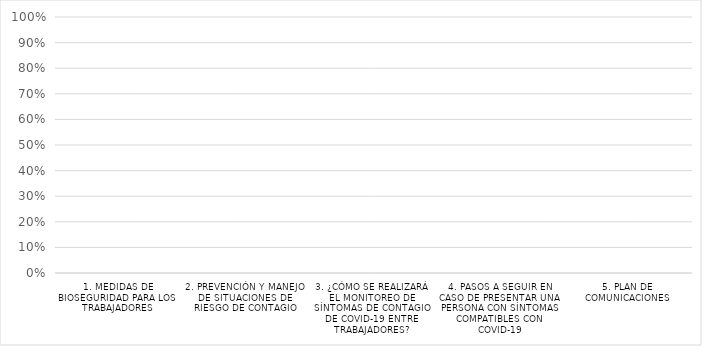
| Category | Series 0 |
|---|---|
| 1. MEDIDAS DE BIOSEGURIDAD PARA LOS TRABAJADORES | 0 |
| 2. PREVENCIÓN Y MANEJO DE SITUACIONES DE RIESGO DE CONTAGIO | 0 |
| 3. ¿CÓMO SE REALIZARÁ EL MONITOREO DE SÍNTOMAS DE CONTAGIO DE COVID-19 ENTRE TRABAJADORES? | 0 |
| 4. PASOS A SEGUIR EN CASO DE PRESENTAR UNA PERSONA CON SÍNTOMAS COMPATIBLES CON COVID-19 | 0 |
| 5. PLAN DE COMUNICACIONES | 0 |